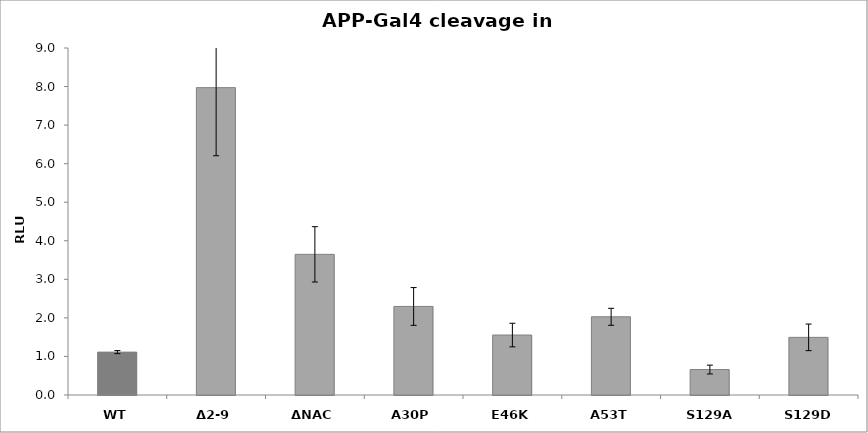
| Category | Series 0 |
|---|---|
| WT | 1.112 |
| Δ2-9 | 7.972 |
| ΔNAC | 3.648 |
| A30P | 2.297 |
| E46K | 1.555 |
| A53T | 2.028 |
| S129A | 0.66 |
| S129D | 1.495 |